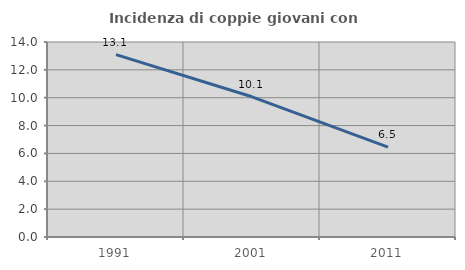
| Category | Incidenza di coppie giovani con figli |
|---|---|
| 1991.0 | 13.098 |
| 2001.0 | 10.066 |
| 2011.0 | 6.452 |